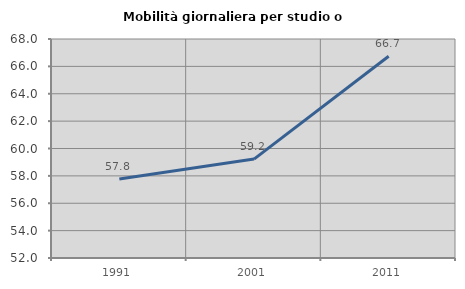
| Category | Mobilità giornaliera per studio o lavoro |
|---|---|
| 1991.0 | 57.775 |
| 2001.0 | 59.225 |
| 2011.0 | 66.737 |